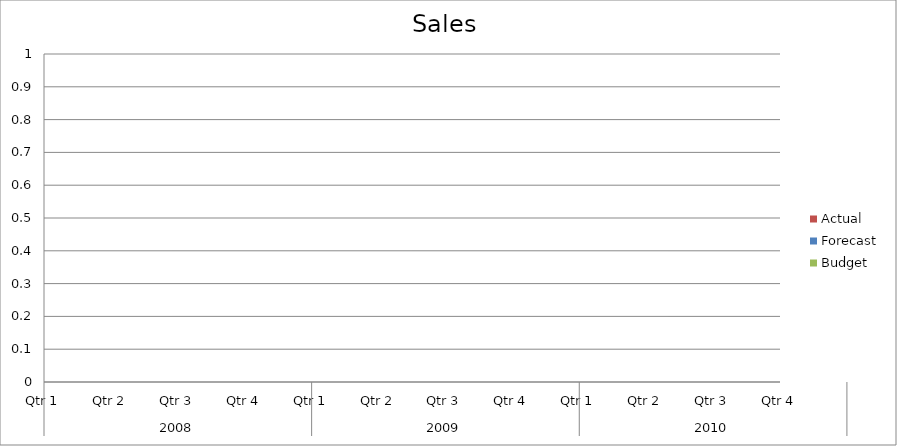
| Category | Budget | Forecast | Actual |
|---|---|---|---|
| 0 | 2680 | 530 | 2560 |
| 1 | 650 | 1320 | 2590 |
| 2 | 2420 | 2090 | 2370 |
| 3 | 1310 | 3020 | 1620 |
| 4 | 1720 | 1830 | 2880 |
| 5 | 2700 | 2020 | 1340 |
| 6 | 710 | 1010 | 2460 |
| 7 | 2780 | 2130 | 2880 |
| 8 | 2940 | 2080 | 700 |
| 9 | 2070 | 3350 | 870 |
| 10 | 1660 | 1220 | 1030 |
| 11 | 1310 | 570 | 960 |